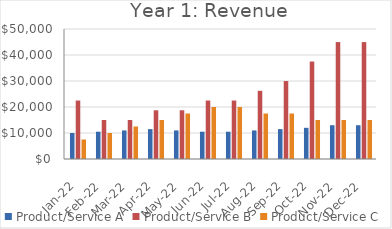
| Category | Product/Service A | Product/Service B | Product/Service C |
|---|---|---|---|
| 2022-01-16 | 9995 | 22485 | 7498.5 |
| 2022-02-16 | 10494.75 | 14990 | 9998 |
| 2022-03-16 | 10994.5 | 14990 | 12497.5 |
| 2022-04-16 | 11494.25 | 18737.5 | 14997 |
| 2022-05-16 | 10994.5 | 18737.5 | 17496.5 |
| 2022-06-16 | 10494.75 | 22485 | 19996 |
| 2022-07-16 | 10494.75 | 22485 | 19996 |
| 2022-08-16 | 10994.5 | 26232.5 | 17496.5 |
| 2022-09-16 | 11494.25 | 29980 | 17496.5 |
| 2022-10-16 | 11994 | 37475 | 14997 |
| 2022-11-16 | 12993.5 | 44970 | 14997 |
| 2022-12-16 | 12993.5 | 44970 | 14997 |